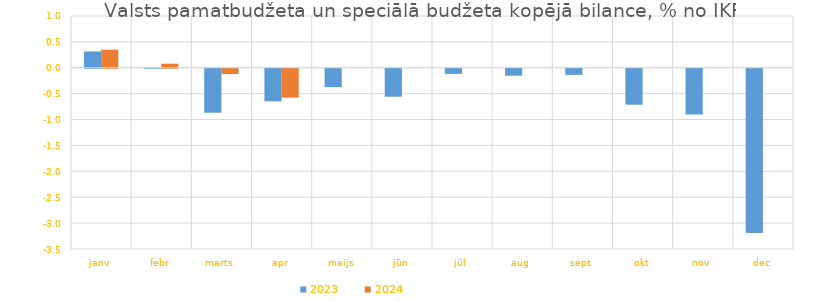
| Category | 2023 | 2024 |
|---|---|---|
| janv | 0.315 | 0.349 |
| febr | 0.007 | 0.079 |
| marts | -0.849 | -0.102 |
| apr | -0.629 | -0.557 |
| maijs | -0.355 | 0 |
| jūn | -0.54 | 0 |
| jūl | -0.098 | 0 |
| aug | -0.134 | 0 |
| sept | -0.118 | 0 |
| okt | -0.693 | 0 |
| nov | -0.882 | 0 |
| dec | -3.171 | 0 |